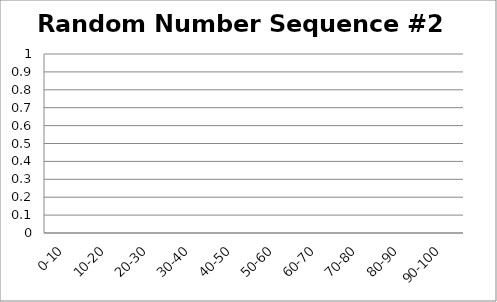
| Category | Random Number Sequence #2 |
|---|---|
| 0-10 | 0 |
| 10-20 | 0 |
| 20-30 | 0 |
| 30-40 | 0 |
| 40-50 | 0 |
| 50-60 | 0 |
| 60-70 | 0 |
| 70-80 | 0 |
| 80-90 | 0 |
| 90-100 | 0 |